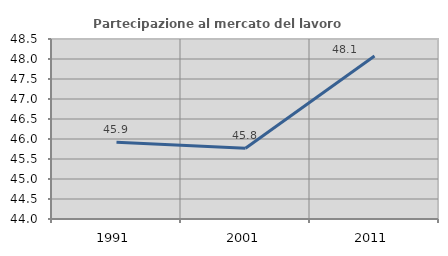
| Category | Partecipazione al mercato del lavoro  femminile |
|---|---|
| 1991.0 | 45.917 |
| 2001.0 | 45.771 |
| 2011.0 | 48.073 |